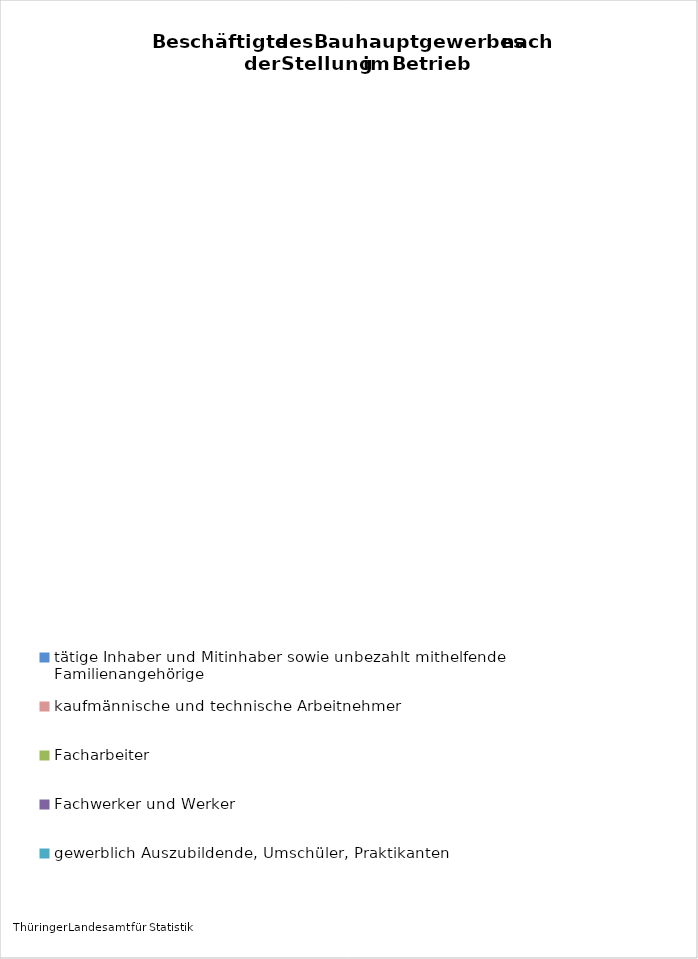
| Category | Beschäftigte |
|---|---|
| tätige Inhaber und Mitinhaber sowie unbezahlt mithelfende Familienangehörige | 2410 |
| kaufmännische und technische Arbeitnehmer | 5180 |
| Facharbeiter | 14459 |
| Fachwerker und Werker | 4007 |
| gewerblich Auszubildende, Umschüler, Praktikanten | 747 |